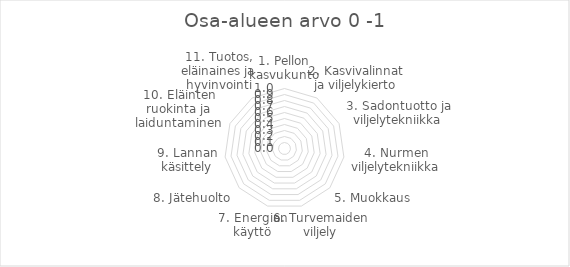
| Category | Indeksi |
|---|---|
| 1. Pellon kasvukunto | 0 |
| 2. Kasvivalinnat ja viljelykierto | 0 |
| 3. Sadontuotto ja viljelytekniikka | 0 |
| 4. Nurmen viljelytekniikka | 0 |
| 5. Muokkaus | 0 |
| 6. Turvemaiden viljely | 0 |
| 7. Energian käyttö | 0 |
| 8. Jätehuolto | 0 |
| 9. Lannan käsittely | 0 |
| 10. Eläinten ruokinta ja laiduntaminen | 0 |
| 11. Tuotos, eläinaines ja hyvinvointi | 0 |